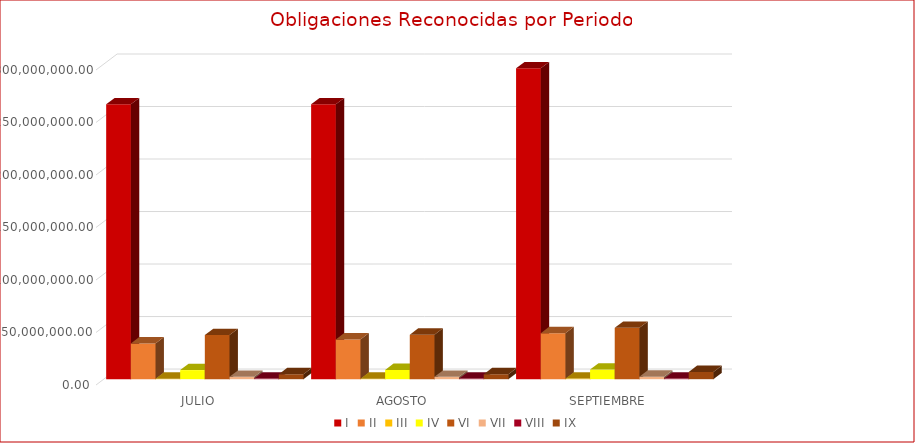
| Category | I | II | III | IV | VI | VII | VIII | IX |
|---|---|---|---|---|---|---|---|---|
| JULIO | 261705945.98 | 34070299.67 | 433325.64 | 8637295.11 | 41972245.4 | 2312016.72 | 613749.98 | 4714551.23 |
| AGOSTO | 261709054.61 | 37827308.27 | 434303.15 | 8868447.48 | 42416271.04 | 2312016.72 | 613749.98 | 4714551.23 |
| SEPTIEMBRE | 296032926.13 | 43742953.26 | 602310.21 | 9134343.22 | 48909299.72 | 2319016.72 | 613451.52 | 6874053.07 |